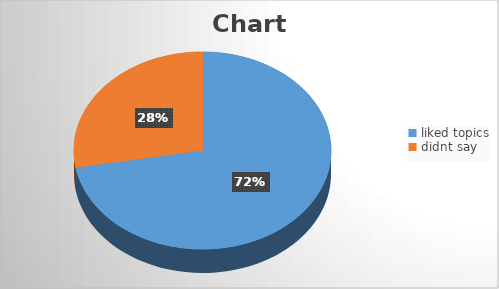
| Category | Series 0 |
|---|---|
| liked topics | 26 |
| didnt say | 10 |